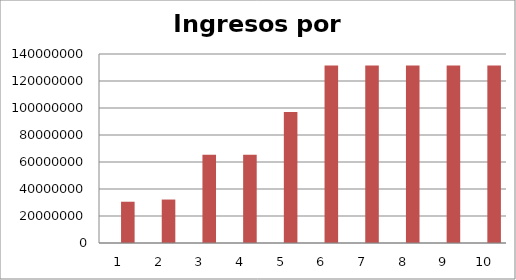
| Category | Series 0 | Series 1 |
|---|---|---|
| 0 | 1 | 30569999.96 |
| 1 | 2 | 32189999.957 |
| 2 | 3 | 65309999.899 |
| 3 | 4 | 65309999.899 |
| 4 | 5 | 96989999.843 |
| 5 | 6 | 131549999.783 |
| 6 | 7 | 131549999.783 |
| 7 | 8 | 131549999.783 |
| 8 | 9 | 131549999.783 |
| 9 | 10 | 131549999.783 |